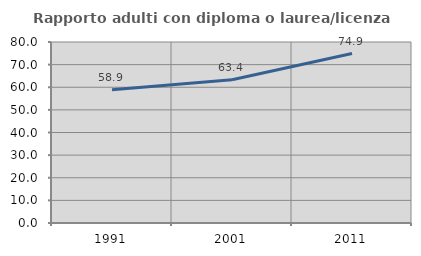
| Category | Rapporto adulti con diploma o laurea/licenza media  |
|---|---|
| 1991.0 | 58.889 |
| 2001.0 | 63.354 |
| 2011.0 | 74.888 |